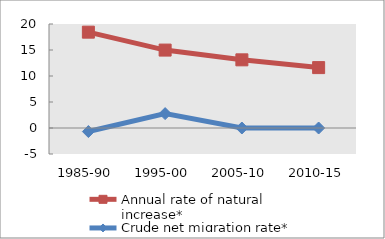
| Category | Annual rate of natural increase* | Crude net migration rate* |
|---|---|---|
| 1985-90 | 18.431 | -0.683 |
| 1995-00 | 14.983 | 2.766 |
| 2005-10 | 13.108 | 0 |
| 2010-15 | 11.615 | 0 |